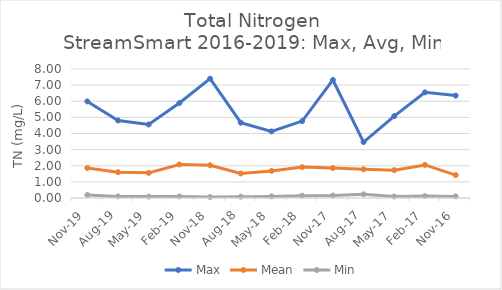
| Category | Max | Mean | Min |
|---|---|---|---|
| 2019-11-01 | 5.99 | 1.86 | 0.19 |
| 2019-08-01 | 4.81 | 1.6 | 0.1 |
| 2019-05-01 | 4.56 | 1.56 | 0.09 |
| 2019-02-01 | 5.89 | 2.08 | 0.1 |
| 2018-11-01 | 7.4 | 2.03 | 0.06 |
| 2018-08-01 | 4.67 | 1.52 | 0.08 |
| 2018-05-01 | 4.13 | 1.681 | 0.1 |
| 2018-02-01 | 4.77 | 1.916 | 0.14 |
| 2017-11-01 | 7.32 | 1.86 | 0.15 |
| 2017-08-01 | 3.47 | 1.776 | 0.23 |
| 2017-05-01 | 5.08 | 1.728 | 0.09 |
| 2017-02-01 | 6.55 | 2.05 | 0.12 |
| 2016-11-01 | 6.35 | 1.42 | 0.1 |